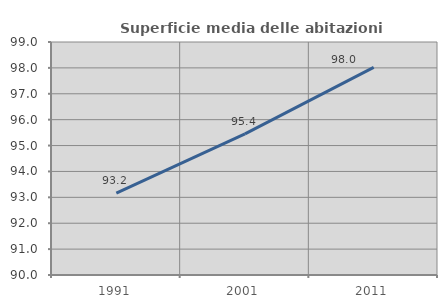
| Category | Superficie media delle abitazioni occupate |
|---|---|
| 1991.0 | 93.165 |
| 2001.0 | 95.45 |
| 2011.0 | 98.02 |